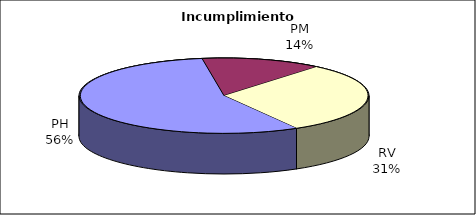
| Category | Valores |
|---|---|
| PH | 298 |
| PM | 72 |
| RV | 163 |